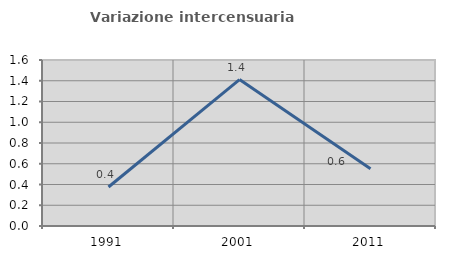
| Category | Variazione intercensuaria annua |
|---|---|
| 1991.0 | 0.376 |
| 2001.0 | 1.412 |
| 2011.0 | 0.552 |